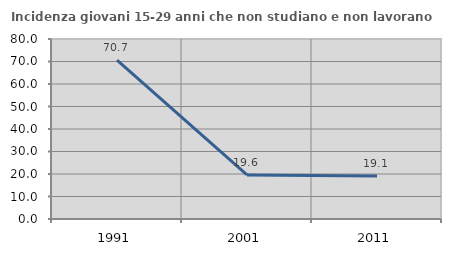
| Category | Incidenza giovani 15-29 anni che non studiano e non lavorano  |
|---|---|
| 1991.0 | 70.652 |
| 2001.0 | 19.565 |
| 2011.0 | 19.101 |